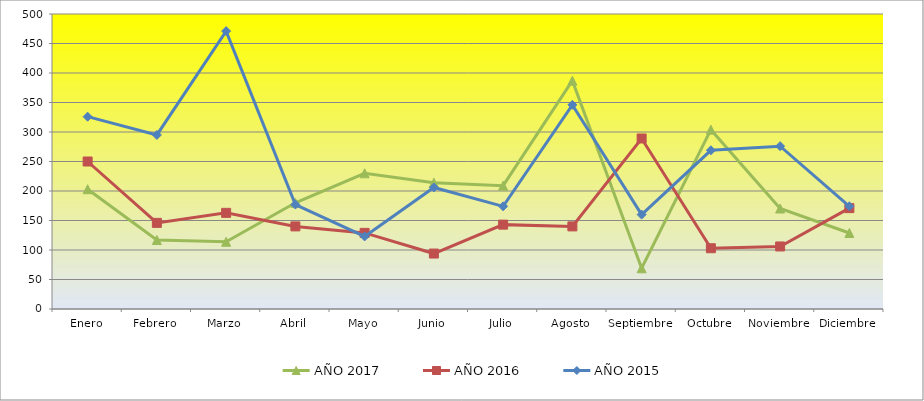
| Category | AÑO 2017 | AÑO 2016 | AÑO 2015 |
|---|---|---|---|
| Enero | 203 | 250 | 326 |
| Febrero | 117 | 146 | 295 |
| Marzo | 114 | 163 | 471 |
| Abril | 180 | 140 | 177 |
| Mayo | 230 | 129 | 123 |
| Junio | 214 | 94 | 206 |
| Julio | 209 | 143 | 174 |
| Agosto | 387 | 140 | 346 |
| Septiembre | 69 | 289 | 160 |
| Octubre | 304 | 103 | 269 |
| Noviembre | 170.333 | 106 | 276 |
| Diciembre | 128.833 | 171 | 174 |